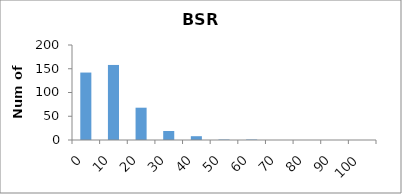
| Category | Series 0 |
|---|---|
| 0.0 | 142 |
| 10.0 | 158 |
| 20.0 | 68 |
| 30.0 | 19 |
| 40.0 | 8 |
| 50.0 | 1 |
| 60.0 | 1 |
| 70.0 | 0 |
| 80.0 | 0 |
| 90.0 | 0 |
| 100.0 | 0 |